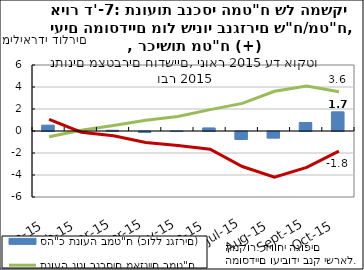
| Category | סה"כ תנועה במט"ח (כולל נגזרים) |
|---|---|
| 0 | 0.532 |
| 1900-01-01 | -0.036 |
| 1900-01-02 | 0.069 |
| 1900-01-03 | -0.079 |
| 1900-01-04 | -0.002 |
| 1900-01-05 | 0.279 |
| 1900-01-06 | -0.716 |
| 1900-01-07 | -0.587 |
| 1900-01-08 | 0.775 |
| 1900-01-09 | 1.742 |